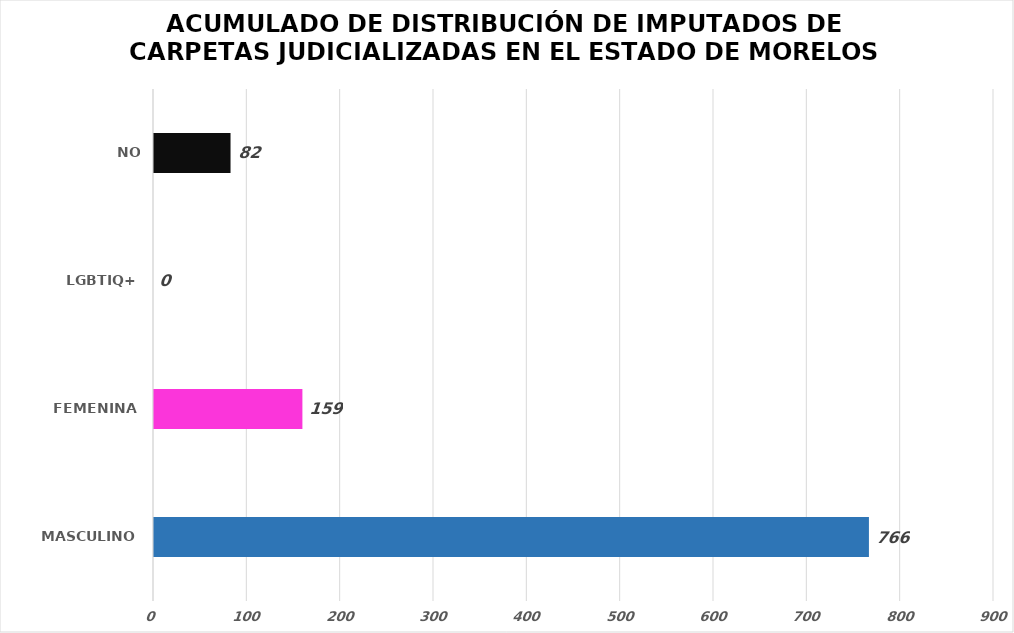
| Category | Series 0 |
|---|---|
| MASCULINO | 766 |
| FEMENINA | 159 |
| LGBTIQ+ | 0 |
| NO ESPECIFICADO | 82 |